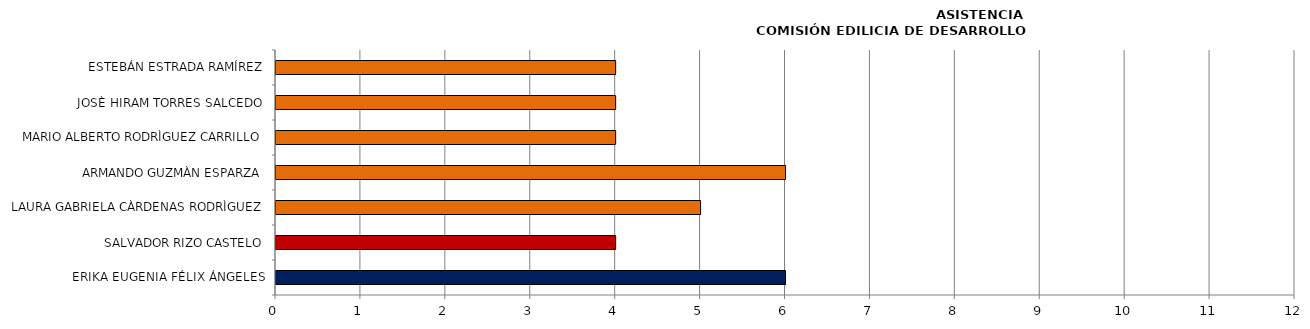
| Category | Series 0 |
|---|---|
| ERIKA EUGENIA FÉLIX ÁNGELES | 6 |
| SALVADOR RIZO CASTELO | 4 |
| LAURA GABRIELA CÀRDENAS RODRÌGUEZ | 5 |
| ARMANDO GUZMÀN ESPARZA | 6 |
| MARIO ALBERTO RODRÌGUEZ CARRILLO | 4 |
| JOSÈ HIRAM TORRES SALCEDO | 4 |
| ESTEBÁN ESTRADA RAMÍREZ | 4 |